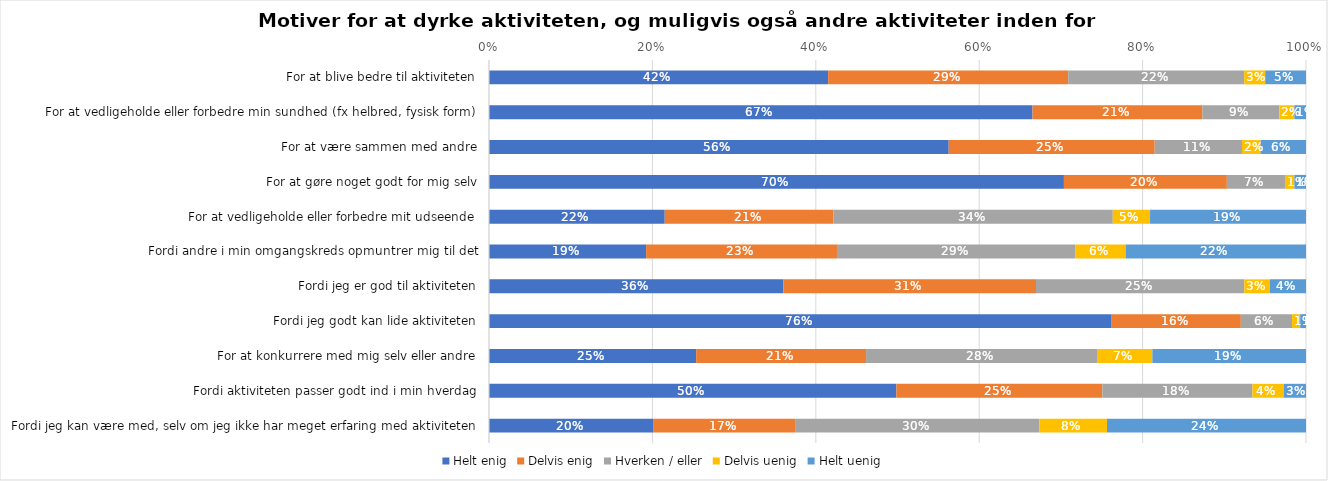
| Category | Helt enig | Delvis enig | Hverken / eller | Delvis uenig | Helt uenig |
|---|---|---|---|---|---|
| For at blive bedre til aktiviteten | 0.415 | 0.294 | 0.215 | 0.026 | 0.05 |
| For at vedligeholde eller forbedre min sundhed (fx helbred, fysisk form) | 0.665 | 0.208 | 0.094 | 0.019 | 0.014 |
| For at være sammen med andre | 0.563 | 0.252 | 0.107 | 0.023 | 0.056 |
| For at gøre noget godt for mig selv | 0.704 | 0.199 | 0.071 | 0.011 | 0.014 |
| For at vedligeholde eller forbedre mit udseende | 0.215 | 0.207 | 0.342 | 0.046 | 0.191 |
| Fordi andre i min omgangskreds opmuntrer mig til det | 0.192 | 0.234 | 0.292 | 0.061 | 0.221 |
| Fordi jeg er god til aktiviteten | 0.36 | 0.309 | 0.255 | 0.031 | 0.044 |
| Fordi jeg godt kan lide aktiviteten | 0.762 | 0.158 | 0.063 | 0.01 | 0.007 |
| For at konkurrere med mig selv eller andre | 0.254 | 0.208 | 0.283 | 0.067 | 0.188 |
| Fordi aktiviteten passer godt ind i min hverdag | 0.499 | 0.252 | 0.184 | 0.038 | 0.027 |
| Fordi jeg kan være med, selv om jeg ikke har meget erfaring med aktiviteten | 0.201 | 0.174 | 0.299 | 0.083 | 0.244 |